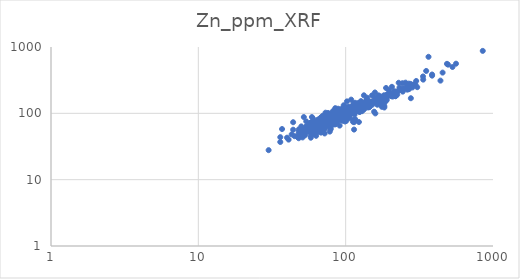
| Category | Zn_ppm_XRF |
|---|---|
| 92.0 | 88.083 |
| 63.0 | 45.83 |
| 85.0 | 68.228 |
| 58.0 | 45.959 |
| 85.0 | 79.8 |
| 70.0 | 60.871 |
| 67.0 | 60.775 |
| 60.0 | 48.265 |
| 72.0 | 77.666 |
| 93.0 | 89.152 |
| 81.0 | 70.045 |
| 97.0 | 90.138 |
| 102.0 | 96.347 |
| 135.0 | 132.193 |
| 80.0 | 85.369 |
| 74.0 | 75.319 |
| 137.0 | 131.576 |
| 852.0 | 873.473 |
| 92.0 | 93.73 |
| 98.0 | 97.377 |
| 66.0 | 66.246 |
| 188.0 | 182.9 |
| 276.0 | 277.956 |
| 268.0 | 280.32 |
| 336.0 | 322.076 |
| 202.0 | 184.306 |
| 214.0 | 215.989 |
| 217.0 | 209.487 |
| 140.0 | 132.634 |
| 86.0 | 80.446 |
| 80.0 | 73.213 |
| 48.0 | 48.52 |
| 70.0 | 59.755 |
| 50.0 | 56.315 |
| 96.0 | 86.795 |
| 89.0 | 83.656 |
| 124.0 | 136.939 |
| 123.0 | 118.407 |
| 133.0 | 114.481 |
| 107.0 | 94.182 |
| 139.0 | 164.649 |
| 244.0 | 231.041 |
| 172.0 | 180.286 |
| 301.0 | 307.281 |
| 297.0 | 272.353 |
| 120.0 | 115.265 |
| 386.0 | 384.744 |
| 270.0 | 265.138 |
| 130.0 | 117.746 |
| 189.0 | 184.959 |
| 71.0 | 64.018 |
| 65.0 | 57.854 |
| 66.0 | 62.784 |
| 62.0 | 59.673 |
| 77.0 | 68.346 |
| 69.0 | 74.854 |
| 119.0 | 111.81 |
| 142.0 | 136.518 |
| 75.0 | 68.59 |
| 111.0 | 112.236 |
| 66.0 | 57.683 |
| 85.0 | 69.52 |
| 50.0 | 63.563 |
| 72.0 | 69.671 |
| 57.0 | 53.58 |
| 51.0 | 43.329 |
| 65.0 | 64.63 |
| 68.0 | 72.801 |
| 66.0 | 69.221 |
| 48.0 | 45.784 |
| 121.0 | 115.396 |
| 51.0 | 57.686 |
| 70.0 | 67.448 |
| 69.0 | 70.486 |
| 82.0 | 89.936 |
| 66.0 | 60.261 |
| 80.0 | 66.526 |
| 86.0 | 91.426 |
| 116.0 | 121.403 |
| 141.0 | 122.869 |
| 115.0 | 96.324 |
| 86.0 | 88.229 |
| 262.0 | 227.465 |
| 99.0 | 78.877 |
| 87.0 | 77.398 |
| 92.0 | 101.5 |
| 82.0 | 108.034 |
| 73.0 | 70.23 |
| 128.0 | 120.451 |
| 72.0 | 49.745 |
| 98.0 | 83.976 |
| 146.0 | 147.602 |
| 76.0 | 72.682 |
| 73.0 | 79.104 |
| 212.0 | 186.563 |
| 66.0 | 65.387 |
| 284.0 | 245.793 |
| 61.0 | 55.15 |
| 58.0 | 52.19 |
| 63.0 | 56.291 |
| 41.0 | 40.159 |
| 90.0 | 82.243 |
| 62.0 | 62.745 |
| 101.0 | 85.15 |
| 116.0 | 81.8 |
| 167.0 | 186.776 |
| 119.0 | 117.054 |
| 123.0 | 139.081 |
| 80.0 | 78.554 |
| 183.0 | 128.732 |
| 137.0 | 140.1 |
| 101.0 | 85.684 |
| 80.0 | 83.339 |
| 107.0 | 98.652 |
| 96.0 | 95.856 |
| 147.0 | 132.682 |
| 81.0 | 71.162 |
| 119.0 | 112.238 |
| 224.0 | 191.38 |
| 72.0 | 65.668 |
| 78.0 | 68.604 |
| 48.0 | 57.202 |
| 36.0 | 43.698 |
| 54.0 | 52.274 |
| 43.0 | 48.148 |
| 77.0 | 80.528 |
| 54.0 | 53.739 |
| 44.0 | 56.658 |
| 75.0 | 76.57 |
| 75.0 | 95.316 |
| 67.0 | 71.388 |
| 65.0 | 59.743 |
| 82.0 | 79.497 |
| 82.0 | 73.988 |
| 101.0 | 92.77 |
| 111.0 | 127.907 |
| 72.0 | 91.298 |
| 204.0 | 182.284 |
| 158.0 | 206.347 |
| 104.0 | 100.42 |
| 140.0 | 171.853 |
| 188.0 | 241.198 |
| 136.0 | 131.966 |
| 75.0 | 90.27 |
| 62.0 | 54.228 |
| 218.0 | 181.87 |
| 55.0 | 54.397 |
| 76.0 | 101.213 |
| 197.0 | 195.337 |
| 123.0 | 113.414 |
| 112.0 | 100.662 |
| 139.0 | 140.653 |
| 131.0 | 141.347 |
| 140.0 | 137.748 |
| 190.0 | 158.479 |
| 172.0 | 146.369 |
| 147.0 | 142.091 |
| 306.0 | 248.072 |
| 77.0 | 77.931 |
| 86.0 | 80.372 |
| 106.0 | 92.388 |
| 101.0 | 86.268 |
| 66.0 | 61.772 |
| 59.0 | 55.995 |
| 61.0 | 58.783 |
| 36.0 | 36.985 |
| 531.0 | 499.698 |
| 487.0 | 557.168 |
| 561.0 | 560.378 |
| 89.0 | 117.326 |
| 80.0 | 65.054 |
| 73.0 | 60.881 |
| 84.0 | 88.469 |
| 55.0 | 58.466 |
| 335.0 | 359.639 |
| 170.0 | 156.661 |
| 100.0 | 83.816 |
| 63.0 | 69.443 |
| 100.0 | 111.762 |
| 66.0 | 71.296 |
| 73.0 | 64.487 |
| 117.0 | 111.366 |
| 207.0 | 199.395 |
| 145.0 | 124.814 |
| 82.0 | 84.872 |
| 85.0 | 87.282 |
| 109.0 | 109.304 |
| 170.0 | 138.862 |
| 183.0 | 122.465 |
| 161.0 | 163.674 |
| 93.0 | 80.298 |
| 65.0 | 63.799 |
| 125.0 | 105.804 |
| 85.0 | 119.705 |
| 191.0 | 176.668 |
| 70.0 | 72.023 |
| 127.0 | 111.293 |
| 181.0 | 140.357 |
| 229.0 | 288.866 |
| 124.0 | 104.772 |
| 164.0 | 134.775 |
| 99.0 | 75.312 |
| 352.0 | 435.348 |
| 277.0 | 168.927 |
| 269.0 | 231.463 |
| 246.0 | 229.627 |
| 208.0 | 178.866 |
| 175.0 | 171.191 |
| 150.0 | 146.046 |
| 186.0 | 149.776 |
| 165.0 | 164.377 |
| 176.0 | 125.387 |
| 129.0 | 107.641 |
| 68.0 | 51.189 |
| 82.0 | 75.74 |
| 59.0 | 69.051 |
| 67.0 | 68.696 |
| 70.0 | 69.21 |
| 78.0 | 73.466 |
| 67.0 | 59.122 |
| 77.0 | 81.166 |
| 88.0 | 74.151 |
| 111.0 | 106.62 |
| 99.0 | 95.677 |
| 94.0 | 87.447 |
| 135.0 | 120.349 |
| 67.0 | 68.736 |
| 78.0 | 63.767 |
| 61.0 | 57.696 |
| 71.0 | 55.924 |
| 74.0 | 66.995 |
| 105.0 | 116.041 |
| 106.0 | 107.726 |
| 116.0 | 107.926 |
| 86.0 | 86.636 |
| 78.0 | 53.04 |
| 112.0 | 74.824 |
| 69.0 | 65.209 |
| 66.0 | 65.128 |
| 106.0 | 84.898 |
| 151.0 | 186.449 |
| 102.0 | 96.478 |
| 138.0 | 145.031 |
| 76.0 | 90.17 |
| 95.0 | 77.056 |
| 182.0 | 168.796 |
| 112.0 | 105.127 |
| 115.0 | 102.625 |
| 86.0 | 81.563 |
| 105.0 | 87.237 |
| 114.0 | 100.368 |
| 133.0 | 136.634 |
| 147.0 | 129.192 |
| 97.0 | 81.271 |
| 118.0 | 133.482 |
| 113.0 | 80.247 |
| 89.0 | 81.423 |
| 218.0 | 181.309 |
| 495.0 | 542.138 |
| 255.0 | 290.148 |
| 231.0 | 221.766 |
| 244.0 | 212.501 |
| 440.0 | 311.076 |
| 455.0 | 411.107 |
| 246.0 | 237.116 |
| 290.0 | 272.422 |
| 197.0 | 221.533 |
| 232.0 | 245.596 |
| 144.0 | 129.15 |
| 200.0 | 191.167 |
| 76.0 | 85.465 |
| 85.0 | 75.932 |
| 70.0 | 68.338 |
| 76.0 | 78.883 |
| 75.0 | 78.53 |
| 89.0 | 80.149 |
| 65.0 | 64.73 |
| 69.0 | 69.753 |
| 86.0 | 92.837 |
| 63.0 | 66.904 |
| 148.0 | 143.203 |
| 123.0 | 119.266 |
| 122.0 | 111.094 |
| 84.0 | 93.859 |
| 80.0 | 82.439 |
| 260.0 | 257.65 |
| 97.0 | 100.393 |
| 74.0 | 84.069 |
| 86.0 | 85.34 |
| 69.0 | 70.236 |
| 65.0 | 57.444 |
| 88.0 | 88.588 |
| 64.0 | 75.781 |
| 84.0 | 90.596 |
| 67.0 | 73.853 |
| 78.0 | 72.62 |
| 63.0 | 73.115 |
| 90.0 | 91.462 |
| 95.0 | 88.243 |
| 95.0 | 89.419 |
| 105.0 | 103.438 |
| 87.0 | 108.682 |
| 111.0 | 110.534 |
| 96.0 | 100.218 |
| 173.0 | 167.932 |
| 168.0 | 146.01 |
| 99.0 | 95.432 |
| 191.0 | 184.35 |
| 125.0 | 133.722 |
| 150.0 | 143.909 |
| 365.0 | 711.403 |
| 107.0 | 98.608 |
| 66.0 | 68.015 |
| 108.0 | 122.29 |
| 87.0 | 88.546 |
| 142.0 | 135.132 |
| 191.0 | 193.209 |
| 174.0 | 170.722 |
| 158.0 | 157.076 |
| 224.0 | 214.198 |
| 140.0 | 154.54 |
| 113.0 | 141.346 |
| 85.0 | 90.432 |
| 88.0 | 101.157 |
| 82.0 | 98.058 |
| 75.0 | 83.961 |
| 91.0 | 89.87 |
| 83.0 | 76.821 |
| 77.0 | 85.8 |
| 90.0 | 101.047 |
| 53.0 | 46.768 |
| 40.0 | 42.949 |
| 62.0 | 59.87 |
| 62.0 | 62.332 |
| 58.0 | 42.899 |
| 63.0 | 49.919 |
| 81.0 | 82.569 |
| 102.0 | 105.565 |
| 83.0 | 84.578 |
| 57.0 | 70.906 |
| 88.0 | 93.084 |
| 80.0 | 87.719 |
| 66.0 | 71.467 |
| 61.0 | 63.494 |
| 94.0 | 86.883 |
| 87.0 | 94.797 |
| 127.0 | 128.891 |
| 163.0 | 160.252 |
| 94.0 | 109.351 |
| 55.0 | 63.788 |
| 156.0 | 105.878 |
| 59.0 | 67.459 |
| 81.0 | 89.344 |
| 67.0 | 71.658 |
| 78.0 | 82.856 |
| 110.0 | 116.309 |
| 119.0 | 108.316 |
| 94.0 | 106.051 |
| 68.0 | 71.836 |
| 54.0 | 75.68 |
| 58.0 | 72.331 |
| 37.0 | 57.962 |
| 103.0 | 124.966 |
| 58.0 | 68.962 |
| 66.0 | 76.189 |
| 70.0 | 91.928 |
| 65.0 | 54.097 |
| 44.0 | 73.455 |
| 56.0 | 63.655 |
| 67.0 | 68.641 |
| 30.0 | 27.852 |
| 59.0 | 87.854 |
| 65.0 | 77.902 |
| 93.0 | 104.96 |
| 79.0 | 90.543 |
| 88.0 | 98.446 |
| 83.0 | 80.351 |
| 116.0 | 144.073 |
| 97.0 | 83.804 |
| 79.0 | 87.626 |
| 73.0 | 79.172 |
| 73.0 | 77.923 |
| 87.0 | 112.249 |
| 77.0 | 90.558 |
| 77.0 | 96.394 |
| 243.0 | 284.44 |
| 118.0 | 114.312 |
| 65.0 | 80.775 |
| 71.0 | 90.678 |
| 68.0 | 86.341 |
| 66.0 | 75.261 |
| 98.0 | 101.996 |
| 49.0 | 48.878 |
| 94.0 | 91.327 |
| 59.0 | 71.339 |
| 77.0 | 69.294 |
| 58.0 | 62.233 |
| 82.0 | 93.66 |
| 97.0 | 102.805 |
| 79.0 | 93.946 |
| 68.0 | 68.064 |
| 77.0 | 97.531 |
| 51.0 | 52.908 |
| 54.0 | 61.821 |
| 182.0 | 187.055 |
| 129.0 | 139.408 |
| 136.0 | 149.56 |
| 141.0 | 137.476 |
| 144.0 | 123.336 |
| 159.0 | 147.072 |
| 69.0 | 74.514 |
| 137.0 | 151.429 |
| 75.0 | 70.799 |
| 149.0 | 151.063 |
| 75.0 | 98.619 |
| 134.0 | 136.794 |
| 73.0 | 102.232 |
| 59.0 | 63.976 |
| 89.0 | 104.876 |
| 206.0 | 251.021 |
| 84.0 | 106.848 |
| 71.0 | 70.482 |
| 82.0 | 98.845 |
| 110.0 | 111.995 |
| 86.0 | 104.26 |
| 157.0 | 175.084 |
| 77.0 | 77.731 |
| 90.0 | 92.202 |
| 88.0 | 96.667 |
| 60.0 | 69.806 |
| 82.0 | 89.856 |
| 79.0 | 57.627 |
| 79.0 | 76.114 |
| 92.0 | 92.163 |
| 67.0 | 68.726 |
| 60.0 | 69.368 |
| 65.0 | 69.37 |
| 68.0 | 86.88 |
| 54.0 | 64.022 |
| 59.0 | 65.167 |
| 82.0 | 100.448 |
| 80.0 | 89.388 |
| 77.0 | 72.095 |
| 65.0 | 60.931 |
| 141.0 | 142.378 |
| 109.0 | 160.975 |
| 72.0 | 78.71 |
| 65.0 | 65.174 |
| 74.0 | 96.195 |
| 79.0 | 84.502 |
| 79.0 | 76.706 |
| 94.0 | 94.388 |
| 110.0 | 122.014 |
| 83.0 | 94.547 |
| 68.0 | 75.278 |
| 62.0 | 69.027 |
| 143.0 | 129.939 |
| 65.0 | 78.139 |
| 75.0 | 81.017 |
| 57.0 | 52.558 |
| 60.0 | 83.482 |
| 47.0 | 44.217 |
| 62.0 | 57.77 |
| 48.0 | 42.154 |
| 73.0 | 65.473 |
| 114.0 | 73.562 |
| 72.0 | 59.36 |
| 79.0 | 58.631 |
| 67.0 | 69.36 |
| 74.0 | 73.403 |
| 59.0 | 58.391 |
| 84.0 | 68.502 |
| 76.0 | 74.393 |
| 66.0 | 60.391 |
| 79.0 | 63.943 |
| 87.0 | 109.518 |
| 68.0 | 82.945 |
| 106.0 | 125.976 |
| 86.0 | 93.039 |
| 127.0 | 152.767 |
| 159.0 | 99.727 |
| 104.0 | 98.596 |
| 95.0 | 85.31 |
| 45.0 | 45.258 |
| 48.0 | 53.07 |
| 79.0 | 98.178 |
| 59.0 | 70.068 |
| 111.0 | 116.959 |
| 100.0 | 112.628 |
| 74.0 | 72.481 |
| 60.0 | 74.73 |
| 102.0 | 97.028 |
| 95.0 | 118.986 |
| 122.0 | 143.492 |
| 106.0 | 107.507 |
| 119.0 | 123.686 |
| 132.0 | 140.975 |
| 109.0 | 106.308 |
| 88.0 | 94.564 |
| 78.0 | 91.101 |
| 94.0 | 90.404 |
| 190.0 | 175.461 |
| 386.0 | 369.778 |
| 77.0 | 74.316 |
| 58.0 | 65.284 |
| 85.0 | 85.9 |
| 71.0 | 78.485 |
| 84.0 | 76.956 |
| 72.0 | 88.897 |
| 97.0 | 132.302 |
| 115.0 | 125.421 |
| 104.0 | 110.61 |
| 95.0 | 103.112 |
| 67.0 | 79.954 |
| 111.0 | 120.941 |
| 188.0 | 165.146 |
| 91.0 | 110.937 |
| 160.0 | 147.182 |
| 102.0 | 98.474 |
| 88.0 | 92.658 |
| 61.0 | 66.207 |
| 121.0 | 111.632 |
| 93.0 | 113.937 |
| 94.0 | 95.984 |
| 152.0 | 135.639 |
| 218.0 | 183.532 |
| 140.0 | 136.47 |
| 133.0 | 186.887 |
| 102.0 | 151.368 |
| 94.0 | 86.511 |
| 123.0 | 73.944 |
| 90.0 | 94.194 |
| 90.0 | 84.97 |
| 92.0 | 84.053 |
| 92.0 | 102.224 |
| 92.0 | 90.642 |
| 170.0 | 143.76 |
| 61.0 | 73.264 |
| 105.0 | 103.094 |
| 101.0 | 77.09 |
| 51.0 | 50.167 |
| 49.0 | 50.986 |
| 58.0 | 59.074 |
| 66.0 | 76.534 |
| 78.0 | 87.962 |
| 86.0 | 98.697 |
| 100.0 | 112.892 |
| 85.0 | 86.726 |
| 81.0 | 93.305 |
| 100.0 | 97.248 |
| 62.0 | 72.04 |
| 74.0 | 77.888 |
| 98.0 | 96.972 |
| 81.0 | 75.46 |
| 65.0 | 56.831 |
| 63.0 | 63.707 |
| 59.0 | 64.345 |
| 94.0 | 87.537 |
| 57.0 | 55.109 |
| 49.0 | 55.239 |
| 68.0 | 68.646 |
| 98.0 | 82.006 |
| 55.0 | 59.427 |
| 99.0 | 94.828 |
| 74.0 | 70.688 |
| 58.0 | 62.746 |
| 68.0 | 67.082 |
| 81.0 | 81.264 |
| 82.0 | 85.067 |
| 77.0 | 74.901 |
| 69.0 | 76.311 |
| 176.0 | 164.112 |
| 60.0 | 56.839 |
| 133.0 | 130.984 |
| 58.0 | 71.728 |
| 78.0 | 88.141 |
| 74.0 | 80.704 |
| 89.0 | 95.852 |
| 94.0 | 83.17 |
| 79.0 | 75.521 |
| 91.0 | 65.287 |
| 52.0 | 87.876 |
| 103.0 | 101.616 |
| 132.0 | 114.601 |
| 62.0 | 71.37 |
| 72.0 | 77.198 |
| 61.0 | 64.19 |
| 89.0 | 99.697 |
| 62.0 | 72.942 |
| 114.0 | 56.904 |